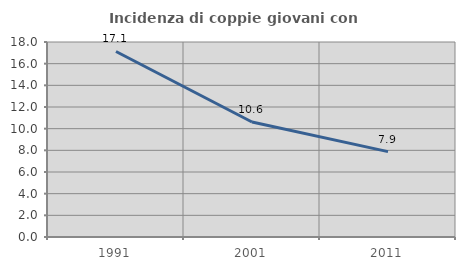
| Category | Incidenza di coppie giovani con figli |
|---|---|
| 1991.0 | 17.127 |
| 2001.0 | 10.612 |
| 2011.0 | 7.884 |